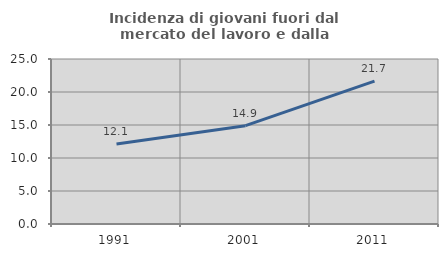
| Category | Incidenza di giovani fuori dal mercato del lavoro e dalla formazione  |
|---|---|
| 1991.0 | 12.108 |
| 2001.0 | 14.894 |
| 2011.0 | 21.659 |